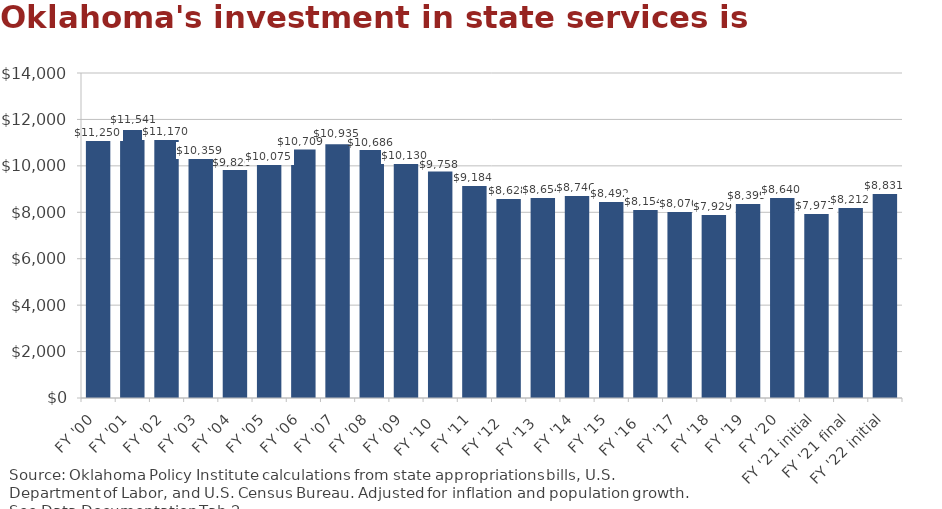
| Category | Budget adjusted to 2021 $ and population |
|---|---|
| FY '00 | 11250.305 |
| FY '01 | 11540.948 |
| FY '02 | 11169.958 |
| FY '03 | 10359.418 |
| FY '04 | 9825.609 |
| FY '05 | 10074.656 |
| FY '06 | 10708.525 |
| FY '07 | 10934.765 |
| FY '08 | 10686.354 |
| FY '09 | 10130.329 |
| FY '10  | 9757.923 |
| FY '11 | 9184.104 |
| FY '12  | 8627.851 |
| FY '13  | 8654.104 |
| FY '14 | 8745.516 |
| FY '15 | 8491.615 |
| FY '16  | 8154.383 |
| FY '17 | 8069.94 |
| FY '18 | 7928.75 |
| FY '19 | 8399.331 |
| FY '20 | 8640.116 |
| FY '21 initial | 7970.883 |
| FY '21 final | 8212.345 |
| FY '22 initial | 8831.026 |